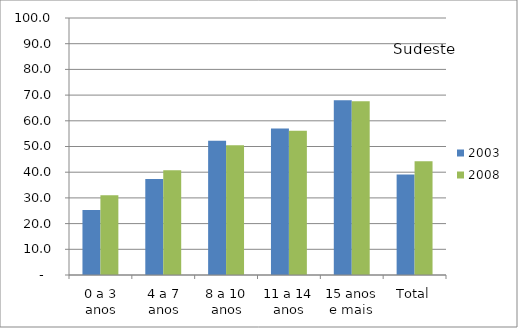
| Category | 2003 | 2008 |
|---|---|---|
| 0 a 3 anos | 25.28 | 31 |
| 4 a 7 anos | 37.36 | 40.79 |
| 8 a 10 anos | 52.19 | 50.45 |
| 11 a 14 anos | 56.96 | 56.08 |
| 15 anos e mais | 67.98 | 67.65 |
| Total | 39.07 | 44.3 |